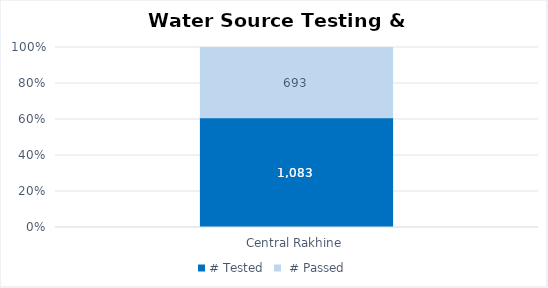
| Category | # Tested |  # Passed |
|---|---|---|
| Central Rakhine | 1083 | 693 |